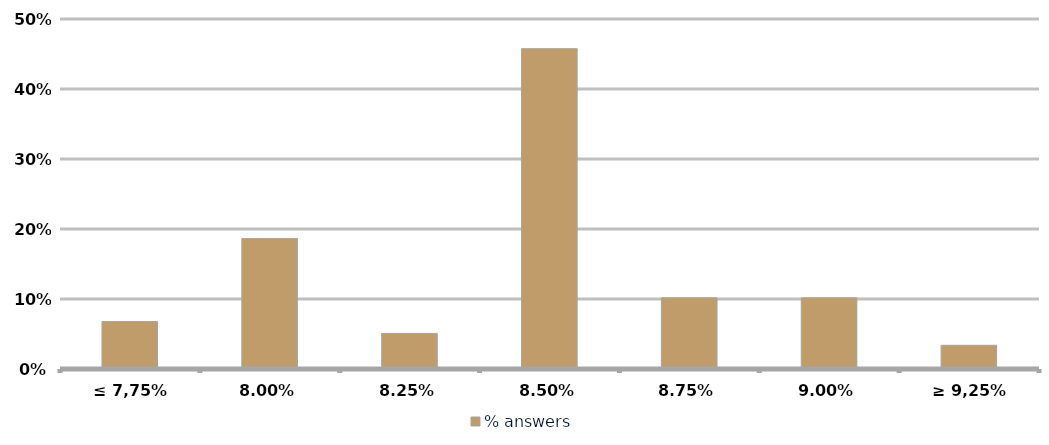
| Category | % answers |
|---|---|
| ≤ 7,75% | 0.068 |
| 8,00% | 0.186 |
| 8,25% | 0.051 |
| 8,50% | 0.458 |
| 8,75% | 0.102 |
| 9,00% | 0.102 |
| ≥ 9,25% | 0.034 |